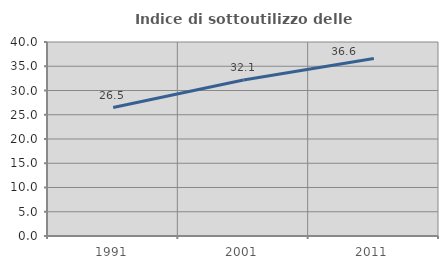
| Category | Indice di sottoutilizzo delle abitazioni  |
|---|---|
| 1991.0 | 26.478 |
| 2001.0 | 32.146 |
| 2011.0 | 36.604 |